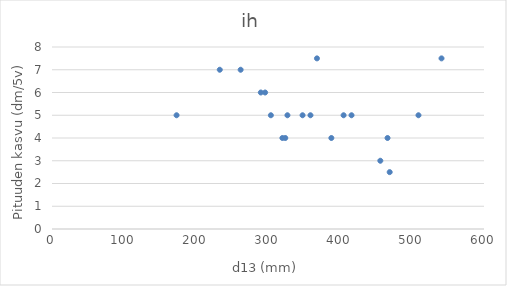
| Category | ih |
|---|---|
| 173.0 | 5 |
| 233.0 | 7 |
| 262.0 | 7 |
| 290.0 | 6 |
| 296.0 | 6 |
| 304.0 | 5 |
| 320.0 | 4 |
| 324.0 | 4 |
| 327.0 | 5 |
| 348.0 | 5 |
| 359.0 | 5 |
| 368.0 | 7.5 |
| 388.0 | 4 |
| 405.0 | 5 |
| 416.0 | 5 |
| 456.0 | 3 |
| 466.0 | 4 |
| 469.0 | 2.5 |
| 509.0 | 5 |
| 541.0 | 7.5 |